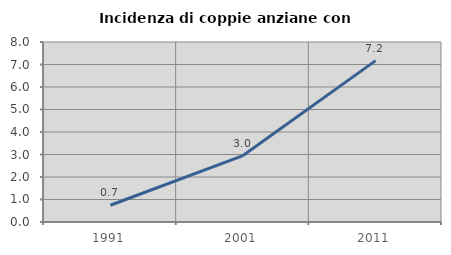
| Category | Incidenza di coppie anziane con figli |
|---|---|
| 1991.0 | 0.743 |
| 2001.0 | 2.952 |
| 2011.0 | 7.171 |